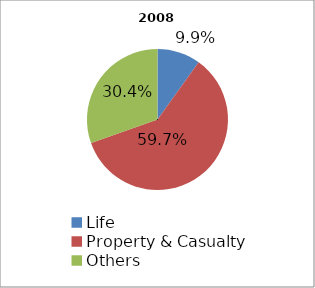
| Category | 2008 |
|---|---|
| Life | 99105432 |
| Property & Casualty | 596086086 |
| Others | 303809194 |